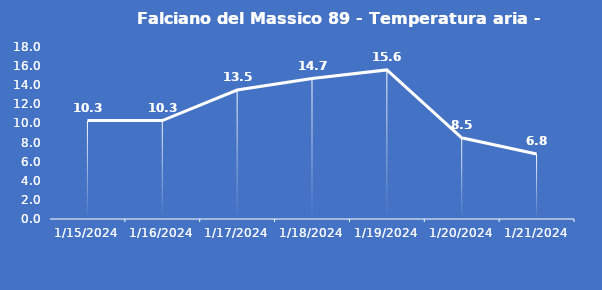
| Category | Falciano del Massico 89 - Temperatura aria - Grezzo (°C) |
|---|---|
| 1/15/24 | 10.3 |
| 1/16/24 | 10.3 |
| 1/17/24 | 13.5 |
| 1/18/24 | 14.7 |
| 1/19/24 | 15.6 |
| 1/20/24 | 8.5 |
| 1/21/24 | 6.8 |